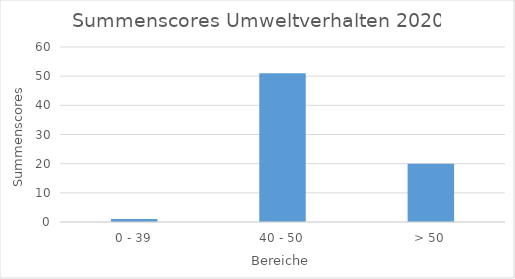
| Category | Series 0 |
|---|---|
| 0 - 39 | 1 |
| 40 - 50 | 51 |
| > 50 | 20 |